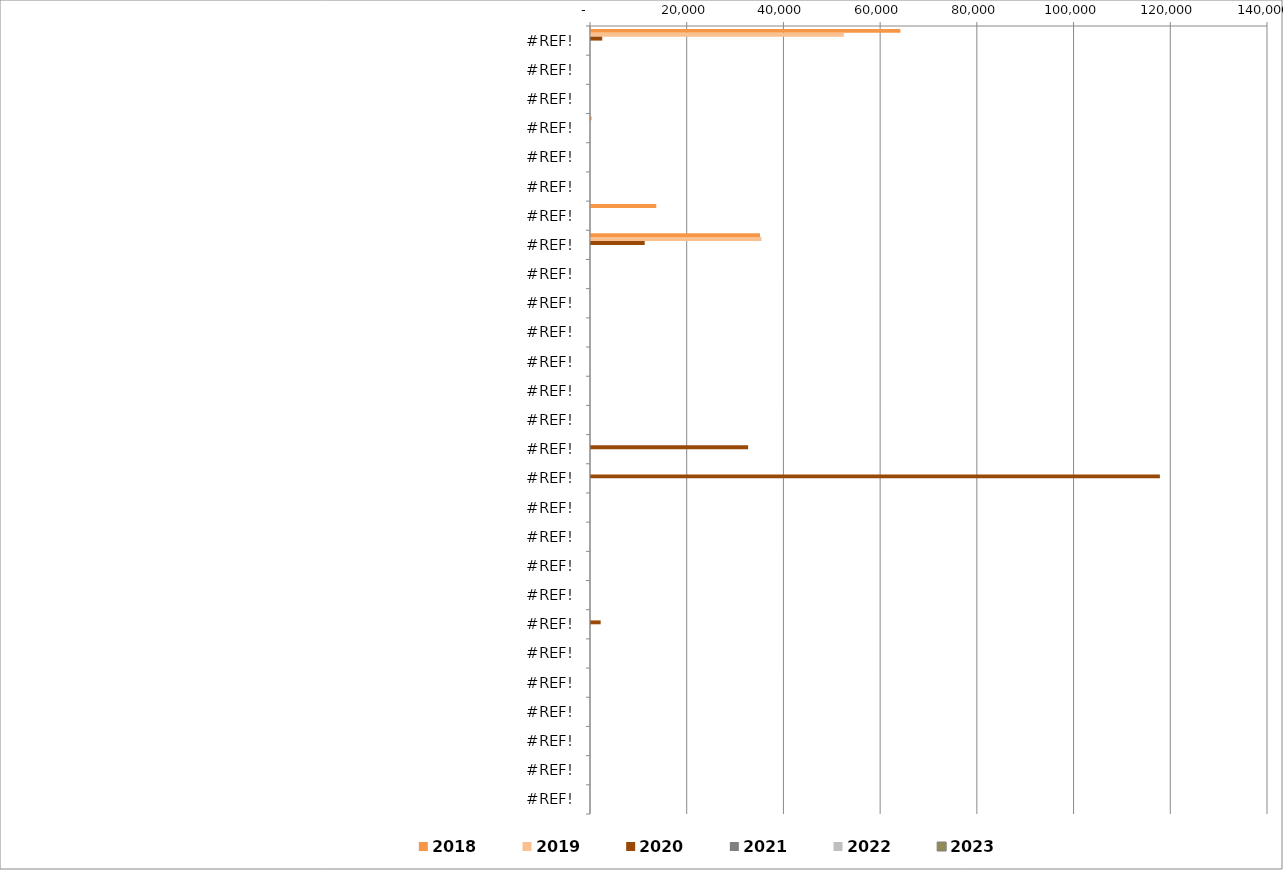
| Category | 2018 | 2019 | 2020 | 2021  | 2022  | 2023  |
|---|---|---|---|---|---|---|
| 0.0 | 63988 | 52282 | 2327 | 0 | 0 | 0 |
| 0.0 | 0 | 0 | 0 | 0 | 0 | 0 |
| 0.0 | 0 | 0 | 0 | 0 | 0 | 0 |
| 0.0 | 120 | 0 | 0 | 0 | 0 | 0 |
| 0.0 | 0 | 0 | 0 | 0 | 0 | 0 |
| 0.0 | 0 | 0 | 0 | 0 | 0 | 0 |
| 0.0 | 13494 | 0 | 0 | 0 | 0 | 0 |
| 0.0 | 34956 | 35243 | 11100 | 0 | 0 | 0 |
| 0.0 | 0 | 0 | 0 | 0 | 0 | 0 |
| 0.0 | 0 | 0 | 0 | 0 | 0 | 0 |
| 0.0 | 0 | 0 | 0 | 0 | 0 | 0 |
| 0.0 | 0 | 0 | 0 | 0 | 0 | 0 |
| 0.0 | 0 | 0 | 0 | 0 | 0 | 0 |
| 0.0 | 0 | 0 | 0 | 0 | 0 | 0 |
| 0.0 | 0 | 0 | 32490 | 0 | 0 | 0 |
| 0.0 | 0 | 0 | 117640 | 0 | 0 | 0 |
| 0.0 | 0 | 0 | 0 | 0 | 0 | 0 |
| 0.0 | 0 | 0 | 0 | 0 | 0 | 0 |
| 0.0 | 0 | 0 | 0 | 0 | 0 | 0 |
| 0.0 | 0 | 0 | 0 | 0 | 0 | 0 |
| 0.0 | 0 | 0 | 2000 | 0 | 0 | 0 |
| 0.0 | 0 | 0 | 0 | 0 | 0 | 0 |
| 0.0 | 0 | 0 | 0 | 0 | 0 | 0 |
| 0.0 | 0 | 0 | 0 | 0 | 0 | 0 |
| 0.0 | 0 | 0 | 0 | 0 | 0 | 0 |
| 0.0 | 0 | 0 | 0 | 0 | 0 | 0 |
| 0.0 | 0 | 0 | 0 | 0 | 0 | 0 |